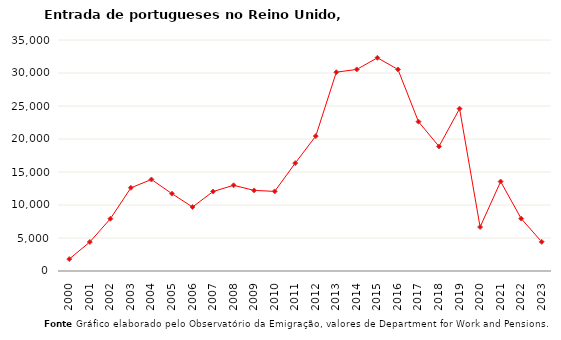
| Category | Entradas |
|---|---|
| 2000.0 | 1811 |
| 2001.0 | 4396 |
| 2002.0 | 7915 |
| 2003.0 | 12603 |
| 2004.0 | 13867 |
| 2005.0 | 11712 |
| 2006.0 | 9696 |
| 2007.0 | 12039 |
| 2008.0 | 12983 |
| 2009.0 | 12211 |
| 2010.0 | 12064 |
| 2011.0 | 16347 |
| 2012.0 | 20443 |
| 2013.0 | 30121 |
| 2014.0 | 30546 |
| 2015.0 | 32301 |
| 2016.0 | 30543 |
| 2017.0 | 22622 |
| 2018.0 | 18871 |
| 2019.0 | 24593 |
| 2020.0 | 6664 |
| 2021.0 | 13551 |
| 2022.0 | 7941 |
| 2023.0 | 4414 |